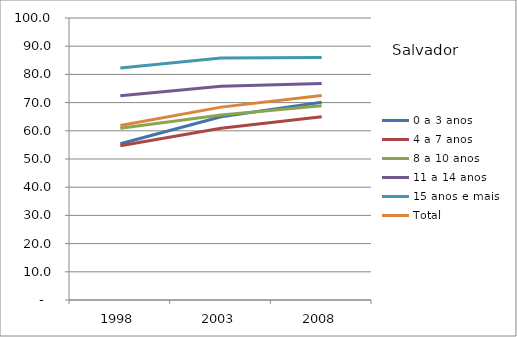
| Category | 0 a 3 anos | 4 a 7 anos | 8 a 10 anos | 11 a 14 anos | 15 anos e mais | Total |
|---|---|---|---|---|---|---|
| 1998.0 | 55.4 | 54.7 | 60.9 | 72.4 | 82.3 | 61.9 |
| 2003.0 | 65 | 60.9 | 65.6 | 75.8 | 85.8 | 68.4 |
| 2008.0 | 70.1 | 65 | 68.9 | 76.8 | 86 | 72.5 |